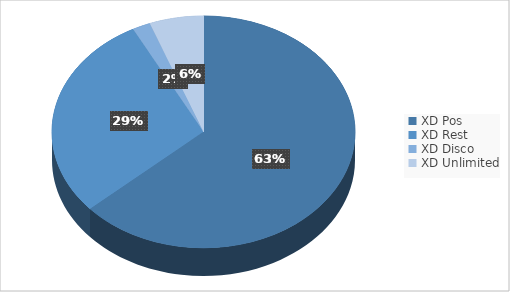
| Category | Series 0 |
|---|---|
| XD Pos | 33 |
| XD Rest | 15 |
| XD Disco | 1 |
| XD Unlimited | 3 |